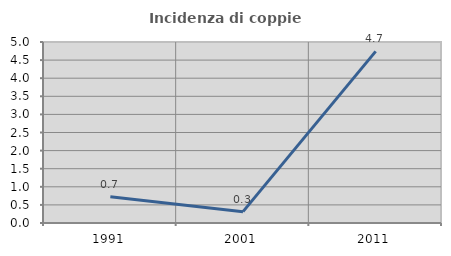
| Category | Incidenza di coppie miste |
|---|---|
| 1991.0 | 0.722 |
| 2001.0 | 0.313 |
| 2011.0 | 4.741 |